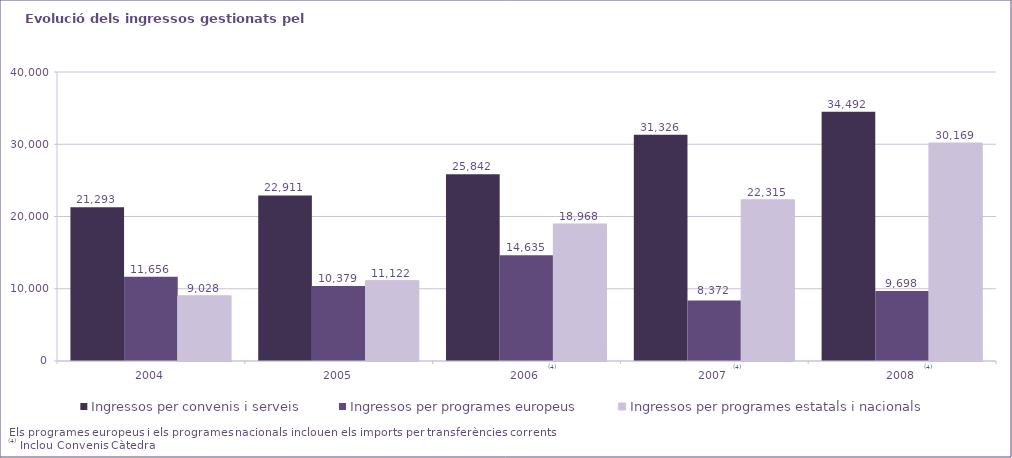
| Category | Ingressos per convenis i serveis | Ingressos per programes europeus | Ingressos per programes estatals i nacionals |
|---|---|---|---|
| 2004.0 | 21293 | 11656 | 9028 |
| 2005.0 | 22911 | 10379 | 11122 |
| 2006.0 | 25842 | 14635 | 18968 |
| 2007.0 | 31326 | 8372 | 22315 |
| 2008.0 | 34492 | 9698 | 30169 |